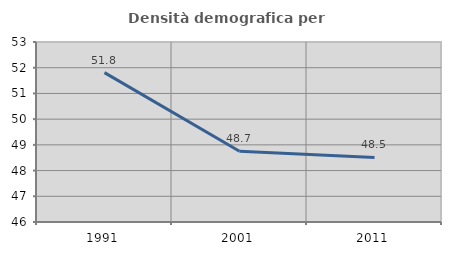
| Category | Densità demografica |
|---|---|
| 1991.0 | 51.81 |
| 2001.0 | 48.749 |
| 2011.0 | 48.509 |